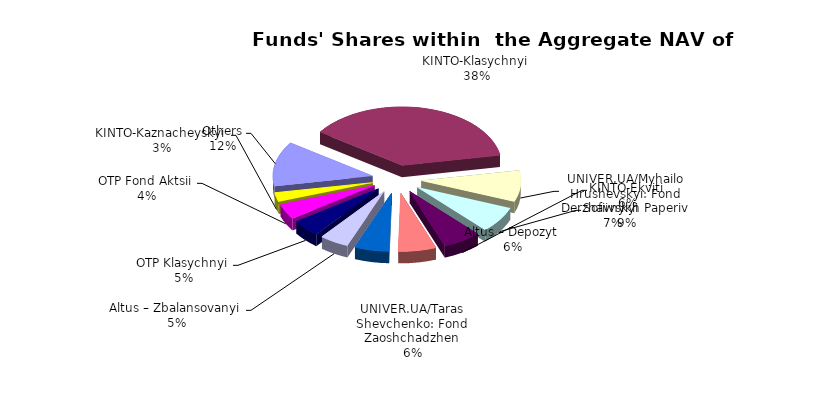
| Category | Series 0 | Series 1 |
|---|---|---|
| Others | 7274849.64 | 0.124 |
| KINTO-Klasychnyi | 22086772.57 | 0.376 |
| UNIVER.UA/Myhailo Hrushevskyi: Fond Derzhavnykh Paperiv | 5066826.4 | 0.086 |
| Sofiivskyi | 4239299.934 | 0.072 |
| KINTO-Ekviti | 3652132.04 | 0.062 |
| Altus – Depozyt | 3603974.76 | 0.061 |
| UNIVER.UA/Taras Shevchenko: Fond Zaoshchadzhen | 3310341.08 | 0.056 |
| Altus – Zbalansovanyi | 2783096.43 | 0.047 |
| ОТP Klasychnyi | 2743044.7 | 0.047 |
| OTP Fond Aktsii | 2480756.82 | 0.042 |
| KINTO-Kaznacheyskyi | 1504145.28 | 0.026 |